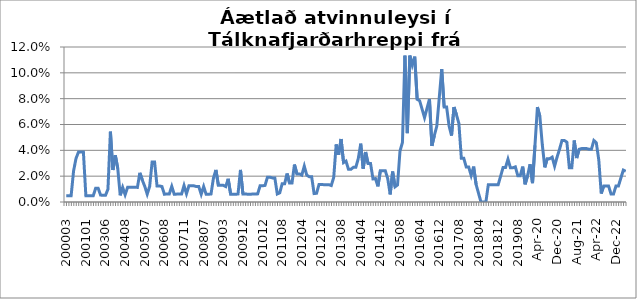
| Category | Series 0 |
|---|---|
| 200003 | 0.005 |
| 200004 | 0.005 |
| 200005 | 0.005 |
| 200008 | 0.024 |
| 200009 | 0.034 |
| 200010 | 0.039 |
| 200011 | 0.039 |
| 200012 | 0.039 |
| 200101 | 0.005 |
| 200112 | 0.005 |
| 200201 | 0.005 |
| 200202 | 0.005 |
| 200301 | 0.011 |
| 200302 | 0.011 |
| 200303 | 0.005 |
| 200304 | 0.005 |
| 200306 | 0.005 |
| 200307 | 0.01 |
| 200308 | 0.054 |
| 200309 | 0.025 |
| 200310 | 0.036 |
| 200311 | 0.026 |
| 200312 | 0.005 |
| 200407 | 0.011 |
| 200408 | 0.006 |
| 200409 | 0.011 |
| 200501 | 0.011 |
| 200502 | 0.011 |
| 200503 | 0.011 |
| 200504 | 0.011 |
| 200505 | 0.023 |
| 200506 | 0.017 |
| 200507 | 0.012 |
| 200508 | 0.006 |
| 200509 | 0.012 |
| 200510 | 0.031 |
| 200511 | 0.031 |
| 200512 | 0.012 |
| 200601 | 0.012 |
| 200607 | 0.012 |
| 200608 | 0.006 |
| 200701 | 0.006 |
| 200702 | 0.006 |
| 200705 | 0.012 |
| 200706 | 0.006 |
| 200707 | 0.006 |
| 200708 | 0.006 |
| 200709 | 0.006 |
| 200711 | 0.013 |
| 200712 | 0.006 |
| 200801 | 0.012 |
| 200802 | 0.012 |
| 200803 | 0.012 |
| 200804 | 0.012 |
| 200805 | 0.012 |
| 200806 | 0.006 |
| 200807 | 0.012 |
| 200808 | 0.006 |
| 200809 | 0.006 |
| 200810 | 0.006 |
| 200811 | 0.019 |
| 200812 | 0.025 |
| 200901 | 0.013 |
| 200902 | 0.013 |
| 200903 | 0.013 |
| 200904 | 0.012 |
| 200905 | 0.018 |
| 200906 | 0.006 |
| 200907 | 0.006 |
| 200909 | 0.006 |
| 200910 | 0.006 |
| 200911 | 0.025 |
| 200912 | 0.006 |
| 201001 | 0.006 |
| 201005 | 0.006 |
| 201006 | 0.006 |
| 201007 | 0.006 |
| 201009 | 0.006 |
| 201010 | 0.006 |
| 201011 | 0.013 |
| 201012 | 0.013 |
| 201101 | 0.013 |
| 201102 | 0.019 |
| 201103 | 0.019 |
| 201104 | 0.019 |
| 201105 | 0.019 |
| 201106 | 0.006 |
| 201107 | 0.007 |
| 201108 | 0.014 |
| 201109 | 0.014 |
| 201110 | 0.022 |
| 201111 | 0.015 |
| 201112 | 0.015 |
| 201201 | 0.029 |
| 201202 | 0.022 |
| 201203 | 0.022 |
| 201204 | 0.021 |
| 201205 | 0.028 |
| 201206 | 0.021 |
| 201207 | 0.02 |
| 201208 | 0.02 |
| 201209 | 0.007 |
| 201210 | 0.007 |
| 201211 | 0.014 |
| 201212 | 0.014 |
| 201301 | 0.013 |
| 201302 | 0.013 |
| 201303 | 0.013 |
| 201304 | 0.013 |
| 201305 | 0.019 |
| 201306 | 0.045 |
| 201307 | 0.037 |
| 201308 | 0.049 |
| 201309 | 0.03 |
| 201310 | 0.032 |
| 201311* | 0.025 |
| 201312 | 0.025 |
| 201401 | 0.027 |
| 201402 | 0.027 |
| 201403 | 0.034 |
| 201404 | 0.045 |
| 201405 | 0.026 |
| 201406 | 0.039 |
| 201407 | 0.03 |
| 201408 | 0.03 |
| 201409 | 0.018 |
| 201410 | 0.018 |
| 201411 | 0.012 |
| 201412 | 0.024 |
| 201501 | 0.024 |
| 201502 | 0.024 |
| 201503 | 0.018 |
| 201504 | 0.006 |
| 201505 | 0.024 |
| 201506 | 0.012 |
| 201507 | 0.013 |
| 201508 | 0.039 |
| 201509 | 0.046 |
| 201510 | 0.113 |
| 201511 | 0.053 |
| 201512 | 0.113 |
| 201601 | 0.106 |
| 201602 | 0.113 |
| 201603 | 0.079 |
| 201604 | 0.078 |
| 201605 | 0.072 |
| 201606 | 0.065 |
| 201607 | 0.072 |
| 201608 | 0.08 |
| 201609 | 0.043 |
| 201610 | 0.051 |
| 201611 | 0.059 |
| 201612 | 0.081 |
| 201701 | 0.103 |
| 201702 | 0.074 |
| 201703 | 0.074 |
| 201704 | 0.059 |
| 201705 | 0.051 |
| 201706 | 0.074 |
| 201707 | 0.068 |
| 201708 | 0.061 |
| 201709 | 0.034 |
| 201710 | 0.034 |
| 201711 | 0.027 |
| 201712 | 0.027 |
| 201801 | 0.021 |
| 201802 | 0.027 |
| 201803 | 0.014 |
| 201804 | 0.007 |
| 201805 | 0 |
| 201806 | 0 |
| 201807 | 0 |
| 201808 | 0.013 |
| 201809 | 0.013 |
| 201810 | 0.013 |
| 201811 | 0.013 |
| 201812 | 0.013 |
| 201901 | 0.02 |
| 201902 | 0.027 |
| 201903 | 0.027 |
| 201904 | 0.033 |
| 201905 | 0.026 |
| 201906 | 0.026 |
| 201907 | 0.027 |
| 201908 | 0.02 |
| 201909 | 0.02 |
| 201910 | 0.027 |
| 201911 | 0.014 |
| 201912 | 0.021 |
| 202001 | 0.029 |
| feb.20 | 0.015 |
| mar.20 | 0.044 |
| apr.20 | 0.074 |
| maí.20 | 0.066 |
| jún.20 | 0.044 |
| júl.20 | 0.027 |
| ágú.20 | 0.034 |
| sep.20 | 0.034 |
| okt.20 | 0.035 |
| nóv.20 | 0.028 |
| des.20 | 0.035 |
| jan.21 | 0.041 |
| feb.21 | 0.048 |
| mar.21 | 0.048 |
| apr.21 | 0.046 |
| maí.21 | 0.026 |
| jún.21 | 0.026 |
| júl.21 | 0.048 |
| ágú.21 | 0.034 |
| sep.21 | 0.041 |
| okt.21 | 0.041 |
| nóv.21 | 0.041 |
| des.21 | 0.041 |
| jan.22 | 0.041 |
| feb.22 | 0.041 |
| mar.22 | 0.048 |
| apr.22 | 0.046 |
| maí.22 | 0.033 |
| jún.22 | 0.007 |
| júl.22 | 0.012 |
| ágú.22 | 0.012 |
| sep.22 | 0.012 |
| okt.22 | 0.006 |
| nóv.22 | 0.006 |
| des.22 | 0.012 |
| jan.23 | 0.012 |
| feb.23 | 0.019 |
| mar.23 | 0.025 |
| apr.23 | 0.024 |